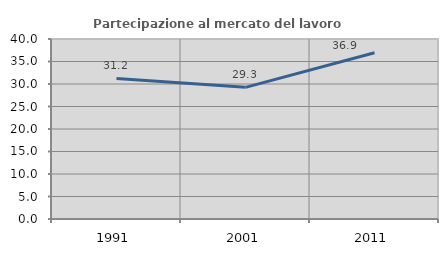
| Category | Partecipazione al mercato del lavoro  femminile |
|---|---|
| 1991.0 | 31.231 |
| 2001.0 | 29.253 |
| 2011.0 | 36.931 |